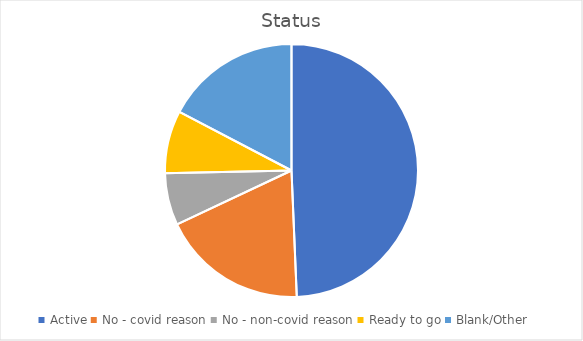
| Category | Series 0 |
|---|---|
| Active | 37 |
| No - covid reason | 14 |
| No - non-covid reason | 5 |
| Ready to go | 6 |
| Blank/Other | 13 |